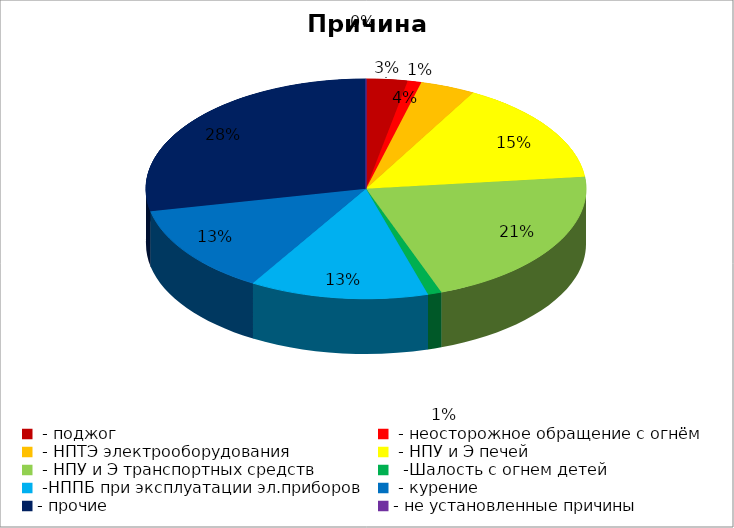
| Category | Причина пожара |
|---|---|
|  - поджог | 3 |
|  - неосторожное обращение с огнём | 1 |
|  - НПТЭ электрооборудования | 4 |
|  - НПУ и Э печей | 15 |
|  - НПУ и Э транспортных средств | 21 |
|   -Шалость с огнем детей | 1 |
|  -НППБ при эксплуатации эл.приборов | 13 |
|  - курение | 13 |
| - прочие | 28 |
| - не установленные причины | 0 |